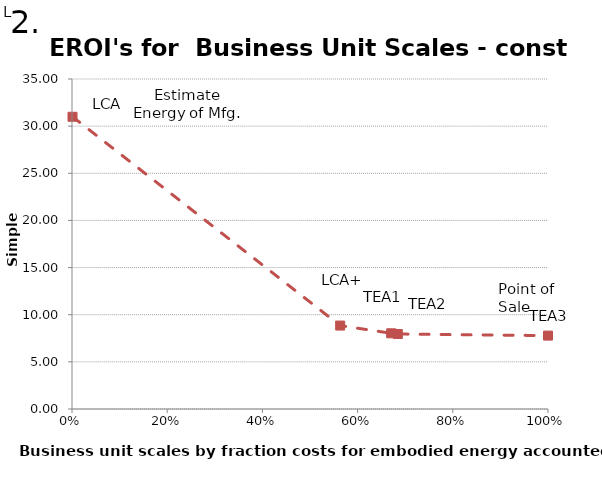
| Category |  simple EROI |
|---|---|
| 0.0010925338773912676 | 30.993 |
| 0.5633281909178405 | 8.85 |
| 0.6705604829002757 | 8.03 |
| 0.6844816293059246 | 7.952 |
| 1.0 | 7.784 |